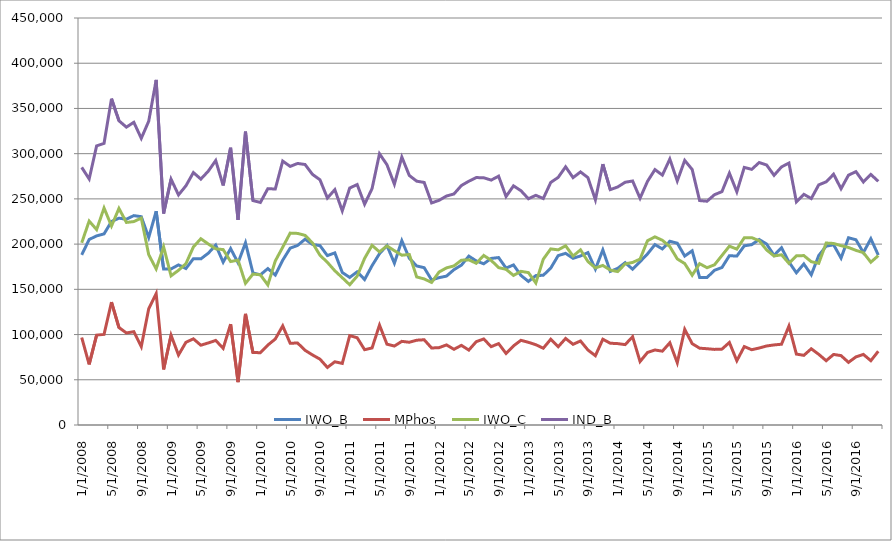
| Category | IWO_B | MPhos | IWO_C | IND_B |
|---|---|---|---|---|
| 1/1/08 | 188125 | 96722 | 201467.654 | 284847 |
| 2/1/08 | 205097 | 66900 | 225484.666 | 271997 |
| 3/1/08 | 209091 | 99450 | 216039.326 | 308541 |
| 4/1/08 | 211309 | 100141 | 239916.414 | 311450 |
| 5/1/08 | 224996 | 135813 | 220024.169 | 360809 |
| 6/1/08 | 228653 | 107751 | 239458.43 | 336404 |
| 7/1/08 | 227535 | 101792 | 223951.274 | 329327 |
| 8/1/08 | 231515 | 103172 | 224916.628 | 334687 |
| 9/1/08 | 230323 | 86620 | 228763.429 | 316943 |
| 10/1/08 | 207367 | 128534 | 188281.94 | 335901 |
| 11/1/08 | 236382 | 145191 | 172594.041 | 381573 |
| 12/1/08 | 172400 | 61417 | 197002.331 | 233817 |
| 1/1/09 | 172565 | 99244 | 164911.629 | 271809 |
| 2/1/09 | 177016 | 77376 | 171051.533 | 254392 |
| 3/1/09 | 173030 | 91474 | 178454.167 | 264504 |
| 4/1/09 | 183865 | 95268 | 196843.136 | 279133 |
| 5/1/09 | 183678 | 88208 | 205937.675 | 271886 |
| 6/1/09 | 189908 | 90738 | 200159.11 | 280646 |
| 7/1/09 | 198913 | 93511 | 194755.071 | 292424 |
| 8/1/09 | 180049 | 84794 | 193949.648 | 264843 |
| 9/1/09 | 195046 | 111504 | 180751.072 | 306550 |
| 10/1/09 | 179311 | 47448 | 182230.384 | 226759 |
| 11/1/09 | 201439 | 122867 | 156645.213 | 324306 |
| 12/1/09 | 168101 | 80035 | 166876.798 | 248136 |
| 1/1/10 | 166048 | 80009 | 166049.893 | 246057 |
| 2/1/10 | 172935 | 88375 | 154838.172 | 261310 |
| 3/1/10 | 165833 | 95074 | 181340.98 | 260907 |
| 4/1/10 | 182231 | 109581 | 196576.716 | 291812 |
| 5/1/10 | 195518 | 90406 | 212155.817 | 285924 |
| 6/1/10 | 198540 | 90638 | 211833.991 | 289178 |
| 7/1/10 | 205421 | 82588 | 209673.023 | 288009 |
| 8/1/10 | 199623 | 77450 | 201324.502 | 277073 |
| 9/1/10 | 198348 | 72828 | 187712.512 | 271176 |
| 10/1/10 | 187321 | 63642 | 179831.586 | 250963 |
| 11/1/10 | 190302 | 69913 | 170526.95 | 260215 |
| 12/1/10 | 168625 | 68095 | 162868.548 | 236720 |
| 1/1/11 | 163196 | 98826 | 155060.762 | 262022 |
| 2/1/11 | 169364 | 96490 | 164585.891 | 265854 |
| 3/1/11 | 160841 | 83249 | 184262.058 | 244090 |
| 4/1/11 | 176161 | 85200 | 198635.666 | 261361 |
| 5/1/11 | 189435 | 110470 | 191395.682 | 299905 |
| 6/1/11 | 198426 | 89357 | 197985.477 | 287783 |
| 7/1/11 | 178927 | 87307 | 192754.182 | 266234 |
| 8/1/11 | 203783 | 92483 | 187745.307 | 296266 |
| 9/1/11 | 184420 | 91499 | 188515.945 | 275919 |
| 10/1/11 | 175833 | 93754 | 163713.752 | 269587 |
| 11/1/11 | 173937 | 94256 | 161491.686 | 268193 |
| 12/1/11 | 160390 | 85134 | 157634.58 | 245524 |
| 1/1/12 | 162908 | 85513 | 169150.697 | 248421 |
| 2/1/12 | 164617 | 88547 | 173719.947 | 253164 |
| 3/1/12 | 171762 | 83689 | 175889.331 | 255451 |
| 4/1/12 | 176736 | 88051 | 182224.295 | 264787 |
| 5/1/12 | 186707 | 82840 | 182596.805 | 269547 |
| 6/1/12 | 181402 | 92171 | 178774.925 | 273573 |
| 7/1/12 | 178243 | 95115 | 187491.135 | 273358 |
| 8/1/12 | 184168 | 86610 | 182062.203 | 270778 |
| 9/1/12 | 185119 | 89986 | 173993.682 | 275105 |
| 10/1/12 | 173503 | 79109 | 172126.071 | 252612 |
| 11/1/12 | 176958 | 87454 | 165390.917 | 264412 |
| 12/1/12 | 165411 | 93633 | 169870.329 | 259044 |
| 1/1/13 | 158748 | 91423 | 168534.105 | 250171 |
| 2/1/13 | 165169 | 88777 | 157030.041 | 253946 |
| 3/1/13 | 165543 | 84865 | 183305.201 | 250408 |
| 4/1/13 | 173410 | 94756 | 194680.501 | 268166 |
| 5/1/13 | 187280 | 86499 | 193638.4 | 273779 |
| 6/1/13 | 189795 | 95664 | 198150.838 | 285459 |
| 7/1/13 | 184293 | 89215 | 186780.498 | 273508 |
| 8/1/13 | 186916 | 92900 | 193644.617 | 279816 |
| 9/1/13 | 190598 | 82893 | 180738.554 | 273491 |
| 10/1/13 | 172340 | 76613 | 173660.828 | 248953 |
| 11/1/13 | 193595 | 94849 | 176402.82 | 288444 |
| 12/1/13 | 169794 | 90419 | 171310.828 | 260213 |
| 1/1/14 | 173216 | 89974 | 169622.264 | 263190 |
| 2/1/14 | 179502 | 88878 | 178153.571 | 268380 |
| 3/1/14 | 172232 | 97568 | 179721.148 | 269800 |
| 4/1/14 | 180583 | 70160 | 183471.412 | 250743 |
| 5/1/14 | 189187 | 80194 | 203725.861 | 269381 |
| 6/1/14 | 199454 | 82928 | 208028.592 | 282382 |
| 7/1/14 | 194638 | 81643 | 204217.67 | 276281 |
| 8/1/14 | 203146 | 90927 | 197255.017 | 294073 |
| 9/1/14 | 201016 | 68830 | 183627.279 | 269846 |
| 10/1/14 | 186794 | 105757 | 178478.718 | 292551 |
| 11/1/14 | 192608 | 89940 | 165602.563 | 282548 |
| 12/1/14 | 163203 | 84935 | 178373.866 | 248138 |
| 1/1/15 | 163097.8 | 84327.2 | 173908.791 | 247425 |
| 2/1/15 | 171056.8 | 83588.2 | 177156.815 | 254645 |
| 3/1/15 | 174142.6 | 83882.4 | 187407.258 | 258025 |
| 4/1/15 | 187199.6 | 91245.4 | 197704.033 | 278445 |
| 5/1/15 | 186761.8 | 71058.2 | 194472.664 | 257820 |
| 6/1/15 | 198100.7 | 86714.3 | 207027.983 | 284815 |
| 7/1/15 | 199421 | 83229 | 207126.311 | 282650 |
| 8/1/15 | 205094.4 | 85104.6 | 203791.219 | 290199 |
| 9/1/15 | 200104.7 | 87377.3 | 193558.374 | 287482 |
| 10/1/15 | 187525.9 | 88532.1 | 186872.526 | 276058 |
| 11/1/15 | 196061.2 | 89306.8 | 188223.58 | 285368 |
| 12/1/15 | 180189.9 | 109398.1 | 178713.663 | 289588 |
| 1/1/16 | 168325 | 78419 | 187134.246 | 246744 |
| 2/1/16 | 178068.5 | 77001.5 | 187297.55 | 255070 |
| 3/1/16 | 166095 | 84289 | 180545.049 | 250384 |
| 4/1/16 | 187353.9 | 78146.1 | 178756.92 | 265500 |
| 5/1/16 | 197762.9 | 71097.1 | 201205.565 | 268860 |
| 6/1/16 | 199240.2 | 78018.8 | 200714.055 | 277259 |
| 7/1/16 | 184522.3 | 76711.7 | 198262.743 | 261234 |
| 8/1/16 | 207022.4 | 69241.6 | 196282.838 | 276264 |
| 9/1/16 | 204806.2 | 75311.8 | 193100.514 | 280118 |
| 10/1/16 | 190650.9 | 78032.1 | 190546.994 | 268683 |
| 11/1/16 | 205938.4 | 71094.6 | 179992.964 | 277033 |
| 12/1/16 | 187858.1 | 81538.9 | 187254.63 | 269397 |